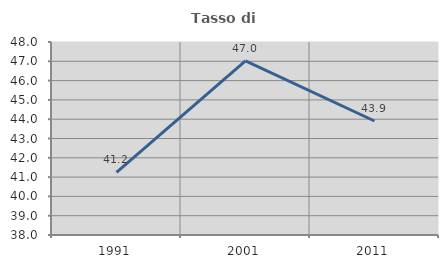
| Category | Tasso di occupazione   |
|---|---|
| 1991.0 | 41.247 |
| 2001.0 | 47.02 |
| 2011.0 | 43.907 |